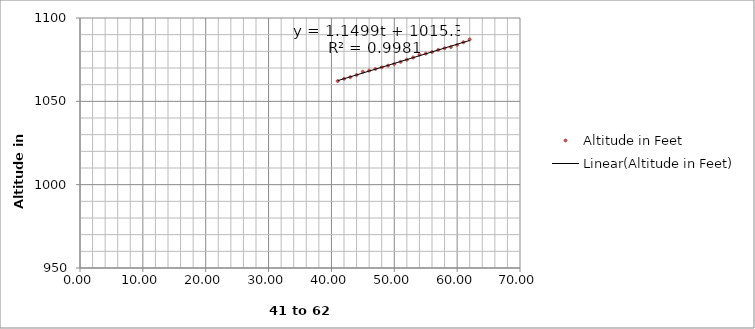
| Category | Altitude in Feet |
|---|---|
| 41.0 | 1062.194 |
| 42.0 | 1063.506 |
| 43.0 | 1064.49 |
| 44.0 | 1065.802 |
| 45.0 | 1067.77 |
| 46.0 | 1068.426 |
| 47.0 | 1069.41 |
| 48.0 | 1070.395 |
| 49.0 | 1071.379 |
| 50.0 | 1072.363 |
| 51.0 | 1073.675 |
| 52.0 | 1074.987 |
| 53.0 | 1076.299 |
| 54.0 | 1077.939 |
| 55.0 | 1078.596 |
| 56.0 | 1079.58 |
| 57.0 | 1080.892 |
| 58.0 | 1081.876 |
| 59.0 | 1082.532 |
| 60.0 | 1083.844 |
| 61.0 | 1085.484 |
| 62.0 | 1087.125 |